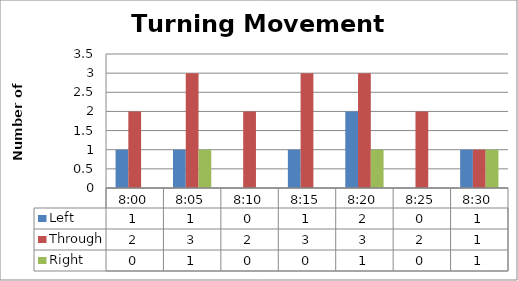
| Category | Left | Through | Right |
|---|---|---|---|
| 0.3333333333333333 | 1 | 2 | 0 |
| 0.3368055555555556 | 1 | 3 | 1 |
| 0.34027777777777773 | 0 | 2 | 0 |
| 0.34375 | 1 | 3 | 0 |
| 0.347222222222222 | 2 | 3 | 1 |
| 0.350694444444445 | 0 | 2 | 0 |
| 0.354166666666667 | 1 | 1 | 1 |